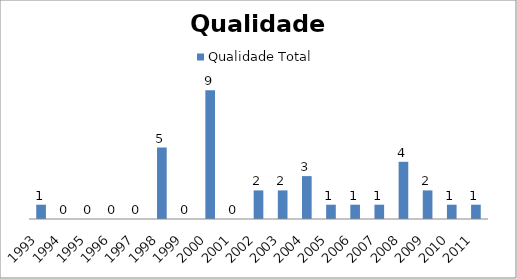
| Category | Qualidade Total |
|---|---|
| 1993.0 | 1 |
| 1994.0 | 0 |
| 1995.0 | 0 |
| 1996.0 | 0 |
| 1997.0 | 0 |
| 1998.0 | 5 |
| 1999.0 | 0 |
| 2000.0 | 9 |
| 2001.0 | 0 |
| 2002.0 | 2 |
| 2003.0 | 2 |
| 2004.0 | 3 |
| 2005.0 | 1 |
| 2006.0 | 1 |
| 2007.0 | 1 |
| 2008.0 | 4 |
| 2009.0 | 2 |
| 2010.0 | 1 |
| 2011.0 | 1 |